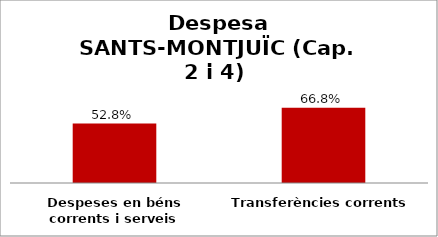
| Category | Series 0 |
|---|---|
| Despeses en béns corrents i serveis | 0.528 |
| Transferències corrents | 0.668 |